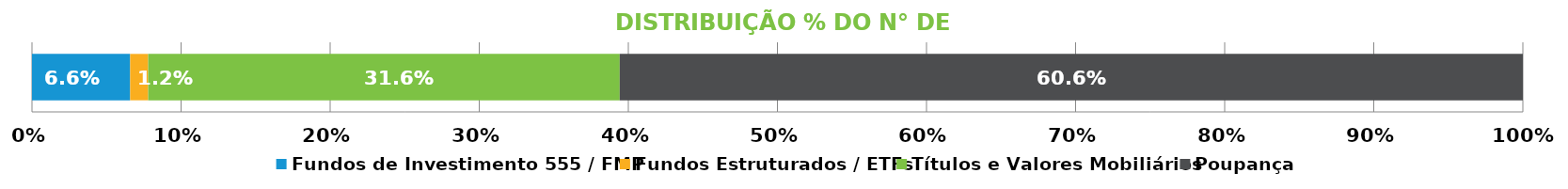
| Category | Fundos de Investimento 555 / FMP | Fundos Estruturados / ETFs | Títulos e Valores Mobiliários | Poupança |
|---|---|---|---|---|
| 0 | 0.066 | 0.012 | 0.316 | 0.606 |